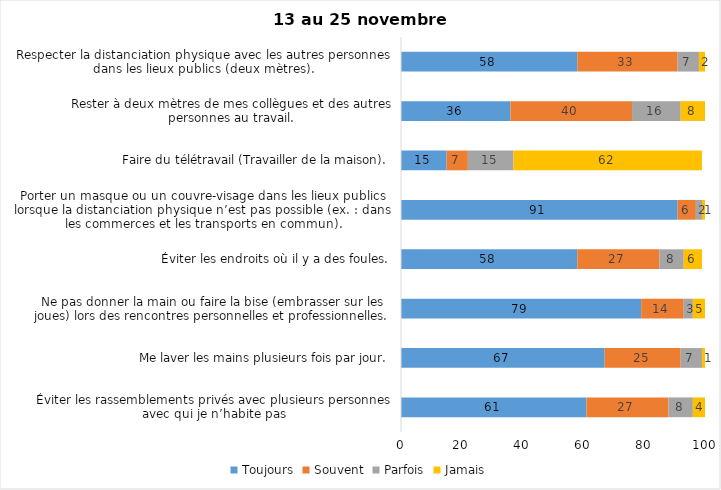
| Category | Toujours | Souvent | Parfois | Jamais |
|---|---|---|---|---|
| Éviter les rassemblements privés avec plusieurs personnes avec qui je n’habite pas | 61 | 27 | 8 | 4 |
| Me laver les mains plusieurs fois par jour. | 67 | 25 | 7 | 1 |
| Ne pas donner la main ou faire la bise (embrasser sur les joues) lors des rencontres personnelles et professionnelles. | 79 | 14 | 3 | 5 |
| Éviter les endroits où il y a des foules. | 58 | 27 | 8 | 6 |
| Porter un masque ou un couvre-visage dans les lieux publics lorsque la distanciation physique n’est pas possible (ex. : dans les commerces et les transports en commun). | 91 | 6 | 2 | 1 |
| Faire du télétravail (Travailler de la maison). | 15 | 7 | 15 | 62 |
| Rester à deux mètres de mes collègues et des autres personnes au travail. | 36 | 40 | 16 | 8 |
| Respecter la distanciation physique avec les autres personnes dans les lieux publics (deux mètres). | 58 | 33 | 7 | 2 |